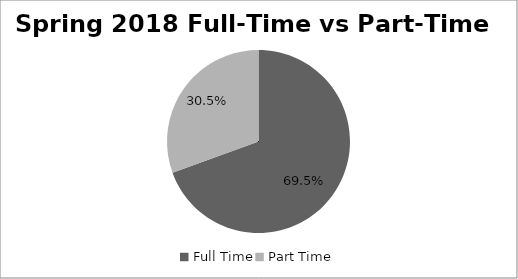
| Category | Series 0 |
|---|---|
| Full Time | 0.695 |
| Part Time | 0.305 |